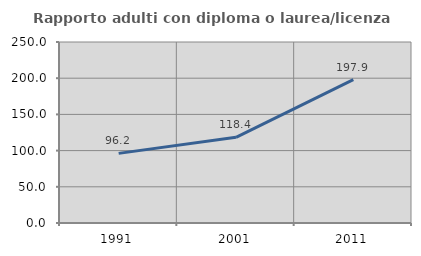
| Category | Rapporto adulti con diploma o laurea/licenza media  |
|---|---|
| 1991.0 | 96.154 |
| 2001.0 | 118.367 |
| 2011.0 | 197.917 |